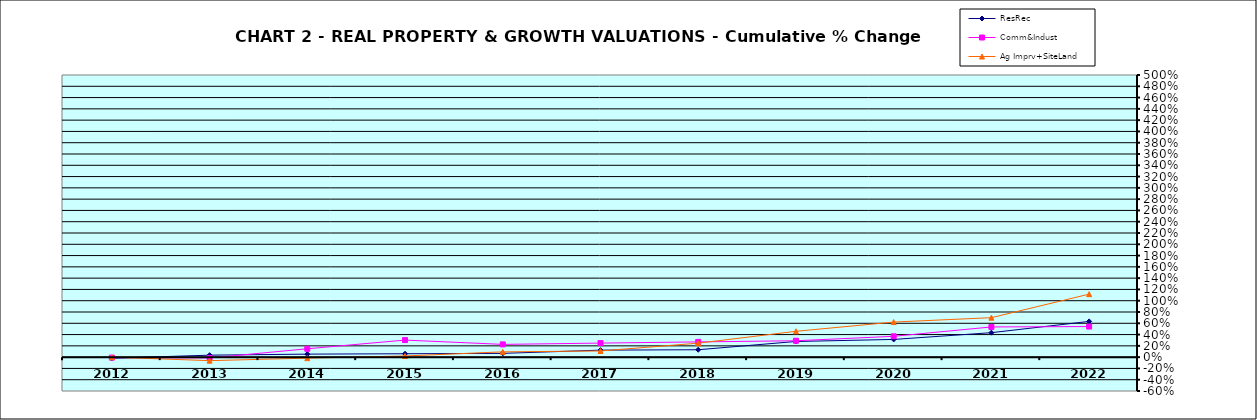
| Category | ResRec | Comm&Indust | Ag Imprv+SiteLand |
|---|---|---|---|
| 2012.0 | -0.02 | -0.008 | 0 |
| 2013.0 | 0.035 | -0.015 | -0.062 |
| 2014.0 | 0.053 | 0.148 | -0.018 |
| 2015.0 | 0.06 | 0.302 | 0.021 |
| 2016.0 | 0.067 | 0.226 | 0.094 |
| 2017.0 | 0.124 | 0.249 | 0.109 |
| 2018.0 | 0.131 | 0.27 | 0.248 |
| 2019.0 | 0.278 | 0.29 | 0.458 |
| 2020.0 | 0.314 | 0.369 | 0.622 |
| 2021.0 | 0.433 | 0.535 | 0.7 |
| 2022.0 | 0.633 | 0.542 | 1.116 |